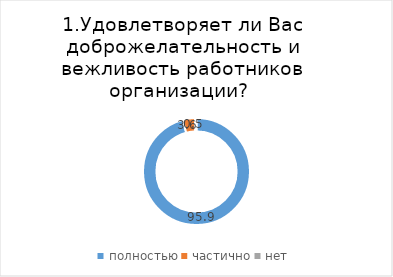
| Category | Асиновский |
|---|---|
| полностью | 95.873 |
| частично | 3.647 |
| нет | 0.48 |